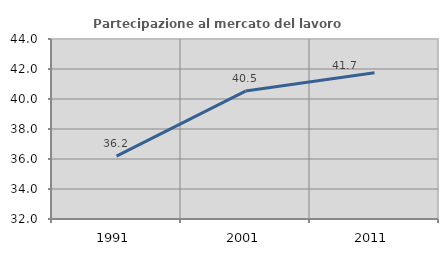
| Category | Partecipazione al mercato del lavoro  femminile |
|---|---|
| 1991.0 | 36.19 |
| 2001.0 | 40.529 |
| 2011.0 | 41.746 |